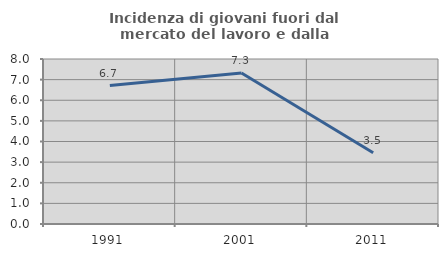
| Category | Incidenza di giovani fuori dal mercato del lavoro e dalla formazione  |
|---|---|
| 1991.0 | 6.715 |
| 2001.0 | 7.317 |
| 2011.0 | 3.456 |